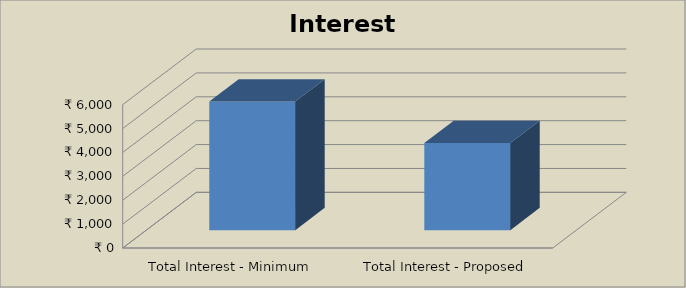
| Category | Series 0 |
|---|---|
| Total Interest - Minimum Payment | 5387.778 |
| Total Interest - Proposed Payment | 3651.066 |